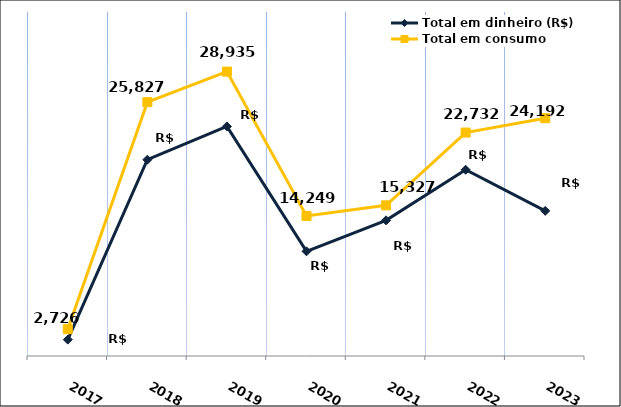
| Category | Total em dinheiro (R$) |
|---|---|
| 2017.0 | 1665.27 |
| 2018.0 | 19972.89 |
| 2019.0 | 23360.15 |
| 2020.0 | 10650.26 |
| 2021.0 | 13802.97 |
| 2022.0 | 18951.16 |
| 2023.0 | 14765.22 |